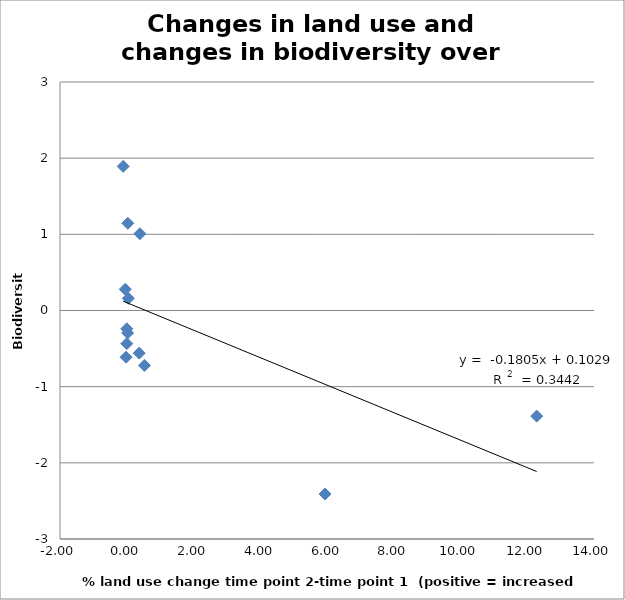
| Category | land use % |
|---|---|
| 0.00279366142453841 | -0.435 |
| 0.0491548317310793 | 0.16 |
| -0.0443741279247751 | 0.279 |
| -0.107625903998274 | 1.892 |
| 5.941136842080302 | -2.41 |
| 12.28210548960178 | -1.386 |
| 0.373974625942213 | -0.559 |
| 0.0258762644083744 | -0.295 |
| 0.530443513399608 | -0.721 |
| -0.0211714890613965 | -0.613 |
| 0.000843368136325073 | -0.24 |
| 0.394473378515176 | 1.009 |
| 0.0323159584903472 | 1.145 |